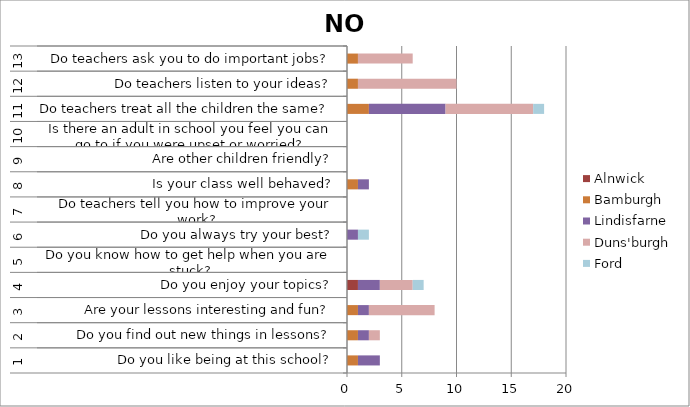
| Category | Alnwick | Bamburgh | Lindisfarne | Duns'burgh | Ford |
|---|---|---|---|---|---|
| 0 | 0 | 1 | 2 | 0 | 0 |
| 1 | 0 | 1 | 1 | 1 | 0 |
| 2 | 0 | 1 | 1 | 6 | 0 |
| 3 | 1 | 0 | 2 | 3 | 1 |
| 4 | 0 | 0 | 0 | 0 | 0 |
| 5 | 0 | 0 | 1 | 0 | 1 |
| 6 | 0 | 0 | 0 | 0 | 0 |
| 7 | 0 | 1 | 1 | 0 | 0 |
| 8 | 0 | 0 | 0 | 0 | 0 |
| 9 | 0 | 0 | 0 | 0 | 0 |
| 10 | 0 | 2 | 7 | 8 | 1 |
| 11 | 0 | 1 | 0 | 9 | 0 |
| 12 | 0 | 1 | 0 | 5 | 0 |